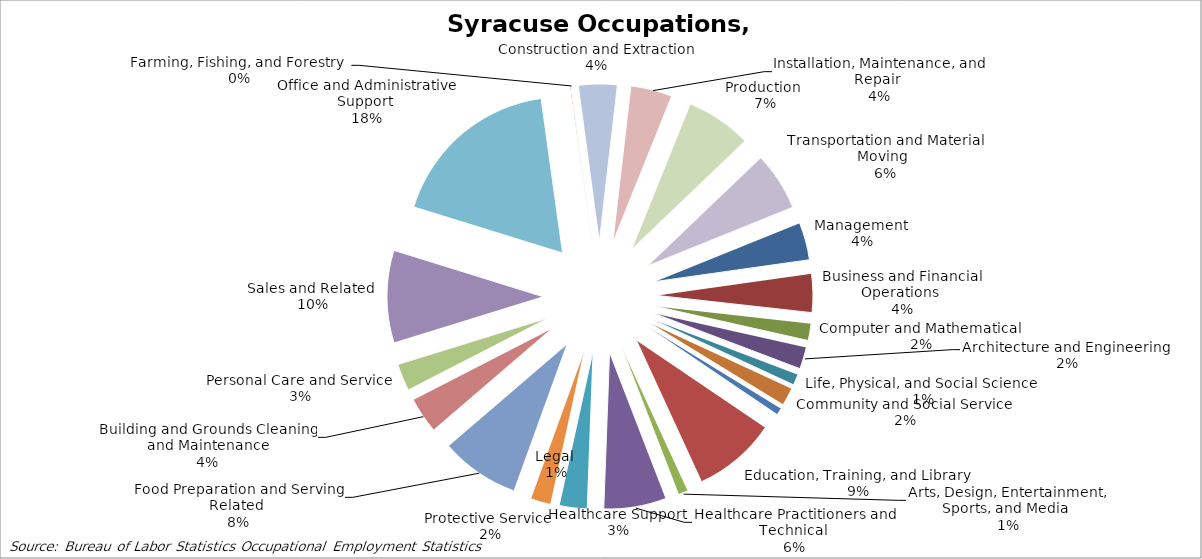
| Category | Syracuse |
|---|---|
| Management  | 0.039 |
| Business and Financial Operations  | 0.04 |
| Computer and Mathematical  | 0.018 |
| Architecture and Engineering  | 0.023 |
| Life, Physical, and Social Science  | 0.011 |
| Community and Social Service  | 0.018 |
| Legal  | 0.007 |
| Education, Training, and Library  | 0.087 |
| Arts, Design, Entertainment, Sports, and Media  | 0.01 |
| Healthcare Practitioners and Technical  | 0.065 |
| Healthcare Support  | 0.029 |
| Protective Service  | 0.021 |
| Food Preparation and Serving Related  | 0.082 |
| Building and Grounds Cleaning and Maintenance | 0.037 |
| Personal Care and Service  | 0.028 |
| Sales and Related  | 0.096 |
| Office and Administrative Support  | 0.18 |
| Farming, Fishing, and Forestry  | 0.001 |
| Construction and Extraction | 0.04 |
| Installation, Maintenance, and Repair  | 0.043 |
| Production  | 0.068 |
| Transportation and Material Moving  | 0.06 |